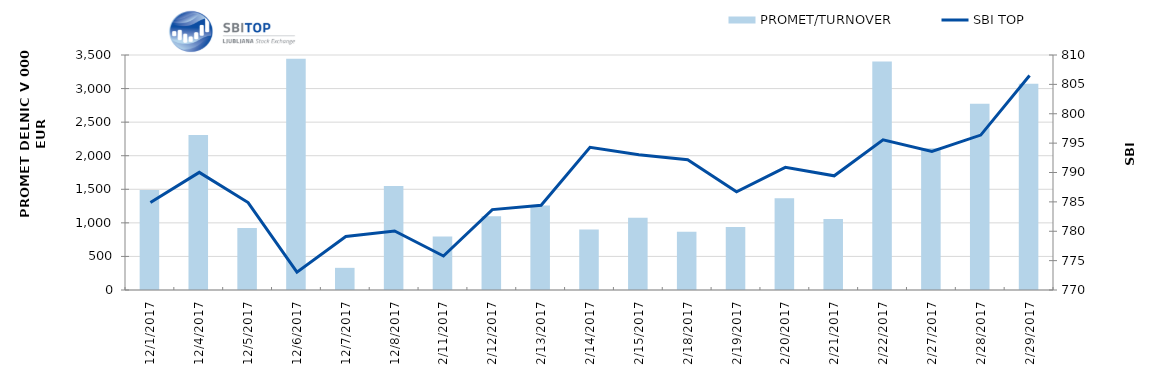
| Category | PROMET/TURNOVER |
|---|---|
| 12/1/17 | 1488 |
| 12/4/17 | 2310 |
| 12/5/17 | 924 |
| 12/6/17 | 3444 |
| 12/7/17 | 330 |
| 12/8/17 | 1550 |
| 12/11/17 | 795 |
| 12/12/17 | 1100 |
| 12/13/17 | 1258 |
| 12/14/17 | 902 |
| 12/15/17 | 1077 |
| 12/18/17 | 866 |
| 12/19/17 | 938 |
| 12/20/17 | 1365 |
| 12/21/17 | 1058 |
| 12/22/17 | 3402 |
| 12/27/17 | 2110 |
| 12/28/17 | 2775 |
| 12/29/17 | 3070 |